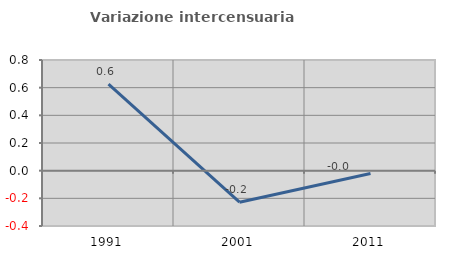
| Category | Variazione intercensuaria annua |
|---|---|
| 1991.0 | 0.625 |
| 2001.0 | -0.228 |
| 2011.0 | -0.02 |